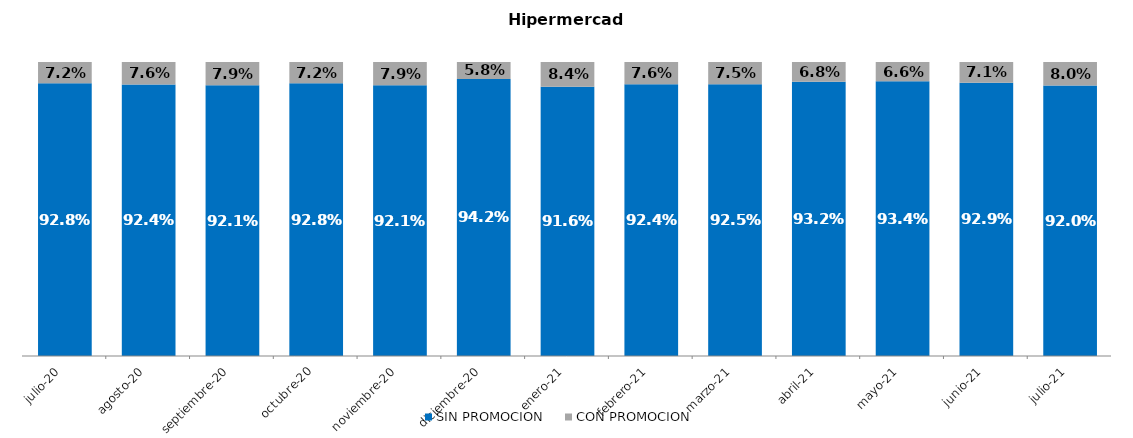
| Category | SIN PROMOCION   | CON PROMOCION   |
|---|---|---|
| 2020-07-01 | 0.928 | 0.072 |
| 2020-08-01 | 0.924 | 0.076 |
| 2020-09-01 | 0.921 | 0.079 |
| 2020-10-01 | 0.928 | 0.072 |
| 2020-11-01 | 0.921 | 0.079 |
| 2020-12-01 | 0.942 | 0.058 |
| 2021-01-01 | 0.916 | 0.084 |
| 2021-02-01 | 0.924 | 0.076 |
| 2021-03-01 | 0.925 | 0.075 |
| 2021-04-01 | 0.932 | 0.068 |
| 2021-05-01 | 0.934 | 0.066 |
| 2021-06-01 | 0.929 | 0.071 |
| 2021-07-01 | 0.92 | 0.08 |